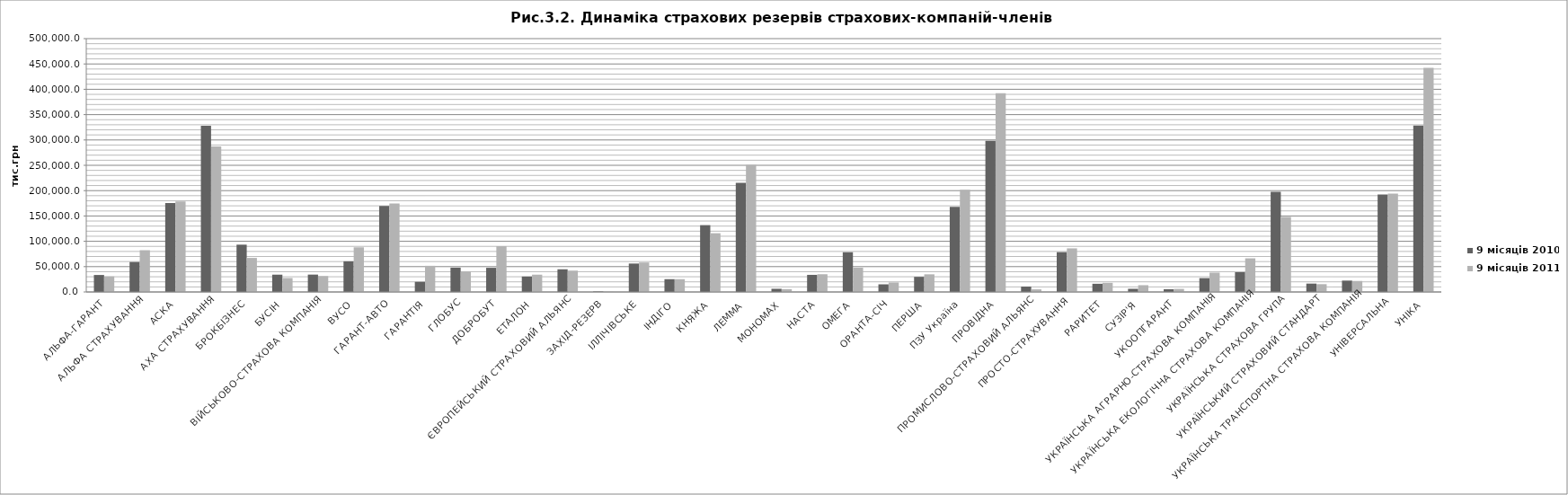
| Category | 9 місяців 2010 | 9 місяців 2011 |
|---|---|---|
| АЛЬФА-ГАРАНТ | 33539.2 | 30704.1 |
| АЛЬФА СТРАХУВАННЯ | 59102.1 | 82424.9 |
| АСКА | 175316 | 178526 |
| АХА СТРАХУВАННЯ | 328229 | 287019 |
| БРОКБІЗНЕС | 93373.7 | 67185 |
| БУСІН | 34166.7 | 27495.7 |
| ВІЙСЬКОВО-СТРАХОВА КОМПАНІЯ | 34303.8 | 31425 |
| ВУСО | 60530.8 | 88134.6 |
| ГАРАНТ-АВТО | 169605 | 174811.9 |
| ГАРАНТІЯ | 19975.8 | 51637.5 |
| ГЛОБУС | 48001.3 | 40476.8 |
| ДОБРОБУТ | 47718.9 | 90459.4 |
| ЕТАЛОН | 30471 | 34177.7 |
| ЄВРОПЕЙСЬКИЙ СТРАХОВИЙ АЛЬЯНС | 44759.4 | 42130.4 |
| ЗАХІД-РЕЗЕРВ | 987.6 | 615.8 |
| ІЛЛІЧІВСЬКЕ | 56114 | 58199 |
| ІНДІГО | 25258.2 | 25279.3 |
| КНЯЖА | 131912.9 | 115946.2 |
| ЛЕММА | 215209 | 251069 |
| МОНОМАХ | 6305 | 5611 |
| НАСТА | 33772.1 | 35001.8 |
| ОМЕГА | 78468 | 47913 |
| ОРАНТА-СІЧ | 15080.7 | 18740.9 |
| ПЕРША | 29853 | 34848 |
| ПЗУ Україна | 167922.7 | 201715.4 |
| ПРОВІДНА | 298387.5 | 392095.2 |
| ПРОМИСЛОВО-СТРАХОВИЙ АЛЬЯНС | 10587 | 5178.5 |
| ПРОСТО-СТРАХУВАННЯ | 78612 | 86086 |
| РАРИТЕТ | 16179.5 | 18037.4 |
| СУЗІР'Я | 6264.4 | 13376.7 |
| УКООПГАРАНТ | 5448 | 6112.5 |
| УКРАЇНСЬКА АГРАРНО-СТРАХОВА КОМПАНІЯ | 27362.5 | 38154.6 |
| УКРАЇНСЬКА ЕКОЛОГІЧНА СТРАХОВА КОМПАНІЯ | 38985.1 | 66365 |
| УКРАЇНСЬКА СТРАХОВА ГРУПА | 197480.2 | 148064.3 |
| УКРАЇНСЬКИЙ СТРАХОВИЙ СТАНДАРТ | 16533.5 | 15392 |
| УКРАЇНСЬКА ТРАНСПОРТНА СТРАХОВА КОМПАНІЯ | 22445 | 21656 |
| УНІВЕРСАЛЬНА | 192254.5 | 194027.7 |
| УНІКА | 328572 | 442357 |